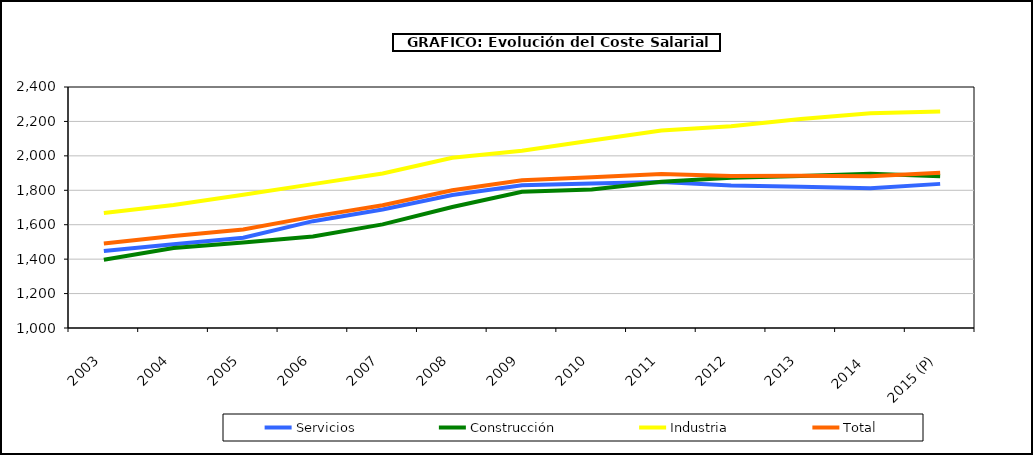
| Category | Servicios | Construcción | Industria | Total |
|---|---|---|---|---|
|  2003 | 1447.032 | 1396.555 | 1668.615 | 1490.318 |
|  2004 | 1486.84 | 1464.175 | 1715.052 | 1533.81 |
|  2005 | 1524.1 | 1496.465 | 1774.282 | 1571.99 |
|  2006 | 1620.663 | 1532.018 | 1835.688 | 1646.96 |
|  2007 | 1688.575 | 1602.058 | 1897.902 | 1713.16 |
|  2008 | 1772.288 | 1703.245 | 1989.208 | 1800.028 |
|  2009 | 1829.705 | 1791.185 | 2030.235 | 1857.978 |
|  2010 | 1838.732 | 1804.735 | 2088.605 | 1875.23 |
|  2011 | 1848.135 | 1849.53 | 2147.29 | 1894.842 |
|  2012 | 1827.48 | 1872.792 | 2172.148 | 1883.54 |
|  2013 | 1820.002 | 1882.945 | 2214.01 | 1883.76 |
|  2014  | 1811.798 | 1895.448 | 2247.635 | 1881.91 |
|  2015 (P) | 1837.24 | 1882.23 | 2257.03 | 1902.37 |